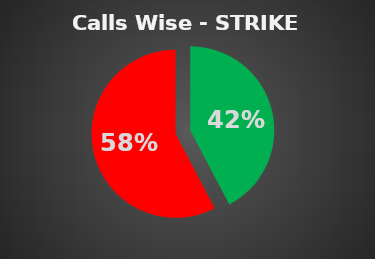
| Category | Series 0 |
|---|---|
| 0 | 0.423 |
| 1 | 0.577 |